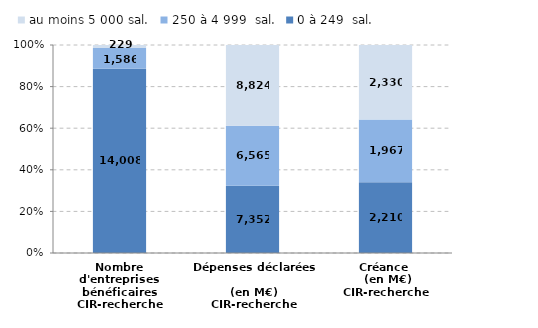
| Category | 0 à 249  sal. | 250 à 4 999  sal. | au moins 5 000 sal. |
|---|---|---|---|
| Nombre d'entreprises bénéficaires
CIR-recherche | 14008 | 1586 | 229 |
| Dépenses déclarées 
(en M€)
CIR-recherche | 7352.12 | 6564.7 | 8824.17 |
| Créance 
 (en M€)
CIR-recherche | 2210.05 | 1966.89 | 2329.94 |